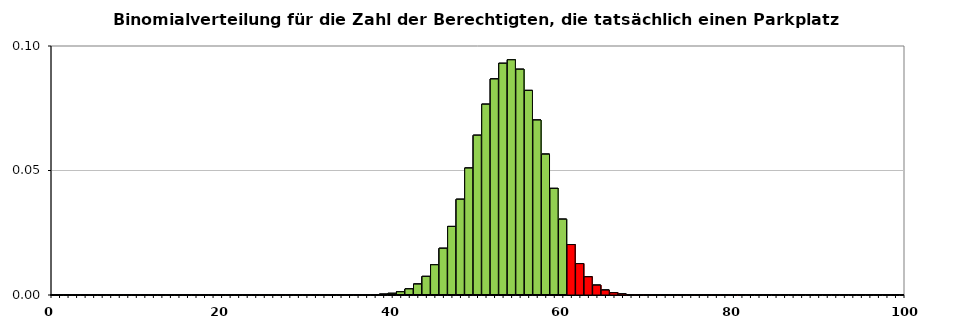
| Category | bekommen ihren Platz | 0,670 | 80 | 0,048 | get their parking lot |
|---|---|---|---|---|---|
| 0.0 | 0 | 0 | 0 | -1 | 0 |
| 1.0 | 0 | 0 | 0 | -1 | 0 |
| 2.0 | 0 | 0 | 0 | -1 | 0 |
| 3.0 | 0 | 0 | 0 | -1 | 0 |
| 4.0 | 0 | 0 | 0 | -1 | 0 |
| 5.0 | 0 | 0 | 0 | -1 | 0 |
| 6.0 | 0 | 0 | 0 | -1 | 0 |
| 7.0 | 0 | 0 | 0 | -1 | 0 |
| 8.0 | 0 | 0 | 0 | -1 | 0 |
| 9.0 | 0 | 0 | 0 | -1 | 0 |
| 10.0 | 0 | 0 | 0 | -1 | 0 |
| 11.0 | 0 | 0 | 0 | -1 | 0 |
| 12.0 | 0 | 0 | 0 | -1 | 0 |
| 13.0 | 0 | 0 | 0 | -1 | 0 |
| 14.0 | 0 | 0 | 0 | -1 | 0 |
| 15.0 | 0 | 0 | 0 | -1 | 0 |
| 16.0 | 0 | 0 | 0 | -1 | 0 |
| 17.0 | 0 | 0 | 0 | -1 | 0 |
| 18.0 | 0 | 0 | 0 | -1 | 0 |
| 19.0 | 0 | 0 | 0 | -1 | 0 |
| 20.0 | 0 | 0 | 0 | -1 | 0 |
| 21.0 | 0 | 0 | 0 | -1 | 0 |
| 22.0 | 0 | 0 | 0 | -1 | 0 |
| 23.0 | 0 | 0 | 0 | -1 | 0 |
| 24.0 | 0 | 0 | 0 | -1 | 0 |
| 25.0 | 0 | 0 | 0 | -1 | 0 |
| 26.0 | 0 | 0 | 0 | -1 | 0 |
| 27.0 | 0 | 0 | 0 | -1 | 0 |
| 28.0 | 0 | 0 | 0 | -1 | 0 |
| 29.0 | 0 | 0 | 0 | -1 | 0 |
| 30.0 | 0 | 0 | 0 | -1 | 0 |
| 31.0 | 0 | 0 | 0 | -1 | 0 |
| 32.0 | 0 | 0 | 0 | -1 | 0 |
| 33.0 | 0 | 0 | 0 | -1 | 0 |
| 34.0 | 0 | 0 | 0 | -1 | 0 |
| 35.0 | 0 | 0 | 0 | -1 | 0 |
| 36.0 | 0 | 0 | 0 | -1 | 0 |
| 37.0 | 0 | 0 | 0 | -1 | 0 |
| 38.0 | 0 | 0 | 0 | -1 | 0 |
| 39.0 | 0 | 0 | 0 | -1 | 0 |
| 40.0 | 0.001 | 0 | 0 | -1 | 0.001 |
| 41.0 | 0.001 | 0 | 0 | -1 | 0.001 |
| 42.0 | 0.002 | 0 | 0 | -1 | 0.002 |
| 43.0 | 0.004 | 0 | 0 | -1 | 0.004 |
| 44.0 | 0.007 | 0 | 0 | -1 | 0.007 |
| 45.0 | 0.012 | 0 | 0 | -1 | 0.012 |
| 46.0 | 0.019 | 0 | 0 | -1 | 0.019 |
| 47.0 | 0.028 | 0 | 0 | -1 | 0.028 |
| 48.0 | 0.038 | 0 | 0 | -1 | 0.038 |
| 49.0 | 0.051 | 0 | 0 | -1 | 0.051 |
| 50.0 | 0.064 | 0 | 0 | -1 | 0.064 |
| 51.0 | 0.077 | 0 | 0 | -1 | 0.077 |
| 52.0 | 0.087 | 0 | 0 | -1 | 0.087 |
| 53.0 | 0.093 | 0 | 0 | -1 | 0.093 |
| 54.0 | 0.094 | 0 | 0 | -1 | 0.094 |
| 55.0 | 0.091 | 0 | 0 | -1 | 0.091 |
| 56.0 | 0.082 | 0 | 0 | -1 | 0.082 |
| 57.0 | 0.07 | 0 | 0 | -1 | 0.07 |
| 58.0 | 0.057 | 0 | 0 | -1 | 0.057 |
| 59.0 | 0.043 | 0 | 0 | -1 | 0.043 |
| 60.0 | 0.03 | 0 | 0 | -1 | 0.03 |
| 61.0 | -1 | 0 | 0 | 0.02 | -1 |
| 62.0 | -1 | 0 | 0 | 0.013 | -1 |
| 63.0 | -1 | 0 | 0 | 0.007 | -1 |
| 64.0 | -1 | 0 | 0 | 0.004 | -1 |
| 65.0 | -1 | 0 | 0 | 0.002 | -1 |
| 66.0 | -1 | 0 | 0 | 0.001 | -1 |
| 67.0 | -1 | 0 | 0 | 0 | -1 |
| 68.0 | -1 | 0 | 0 | 0 | -1 |
| 69.0 | -1 | 0 | 0 | 0 | -1 |
| 70.0 | -1 | 0 | 0 | 0 | -1 |
| 71.0 | -1 | 0 | 0 | 0 | -1 |
| 72.0 | -1 | 0 | 0 | 0 | -1 |
| 73.0 | -1 | 0 | 0 | 0 | -1 |
| 74.0 | -1 | 0 | 0 | 0 | -1 |
| 75.0 | -1 | 0 | 0 | 0 | -1 |
| 76.0 | -1 | 0 | 0 | 0 | -1 |
| 77.0 | -1 | 0 | 0 | 0 | -1 |
| 78.0 | -1 | 0 | 0 | 0 | -1 |
| 79.0 | -1 | 0 | 0 | 0 | -1 |
| 80.0 | -1 | 0 | 0 | 0 | -1 |
| 81.0 | -1 | 0 | 0 | 0 | -1 |
| 82.0 | -1 | 0 | 0 | 0 | -1 |
| 83.0 | -1 | 0 | 0 | 0 | -1 |
| 84.0 | -1 | 0 | 0 | 0 | -1 |
| 85.0 | -1 | 0 | 0 | 0 | -1 |
| 86.0 | -1 | 0 | 0 | 0 | -1 |
| 87.0 | -1 | 0 | 0 | 0 | -1 |
| 88.0 | -1 | 0 | 0 | 0 | -1 |
| 89.0 | -1 | 0 | 0 | 0 | -1 |
| 90.0 | -1 | 0 | 0 | 0 | -1 |
| 91.0 | -1 | 0 | 0 | 0 | -1 |
| 92.0 | -1 | 0 | 0 | 0 | -1 |
| 93.0 | -1 | 0 | 0 | 0 | -1 |
| 94.0 | -1 | 0 | 0 | 0 | -1 |
| 95.0 | -1 | 0 | 0 | 0 | -1 |
| 96.0 | -1 | 0 | 0 | 0 | -1 |
| 97.0 | -1 | 0 | 0 | 0 | -1 |
| 98.0 | -1 | 0 | 0 | 0 | -1 |
| 99.0 | -1 | 0 | 0 | 0 | -1 |
| 100.0 | -1 | 0 | 0 | 0 | -1 |